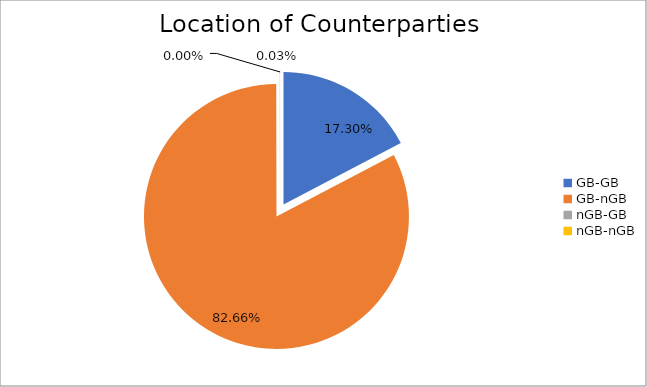
| Category | Series 0 |
|---|---|
| GB-GB | 1854451.753 |
| GB-nGB | 8859856.725 |
| nGB-GB | 73.31 |
| nGB-nGB | 3459.843 |